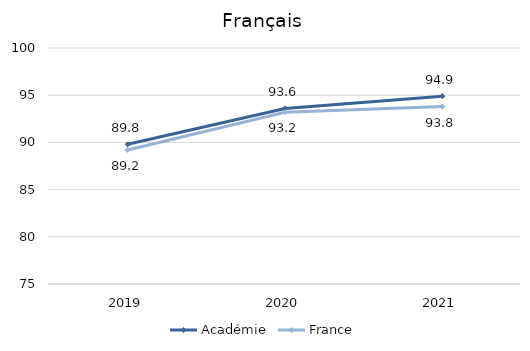
| Category | Académie | France |
|---|---|---|
| 2019.0 | 89.8 | 89.2 |
| 2020.0 | 93.6 | 93.2 |
| 2021.0 | 94.9 | 93.8 |